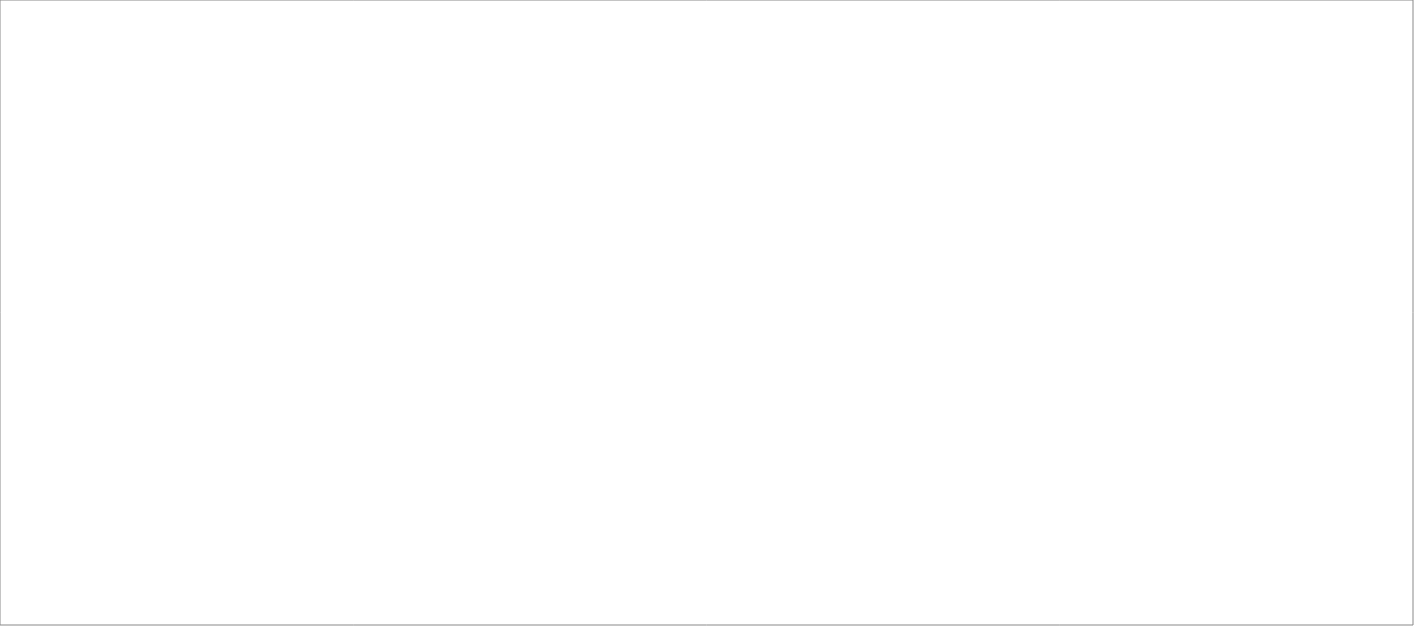
| Category | Total |
|---|---|
| Poolia Sverige AB | 85 |
| Randstad AB | 80 |
| Wise Professionals AB | 65 |
| Tarasso AB | 65 |
| Experis AB | 45 |